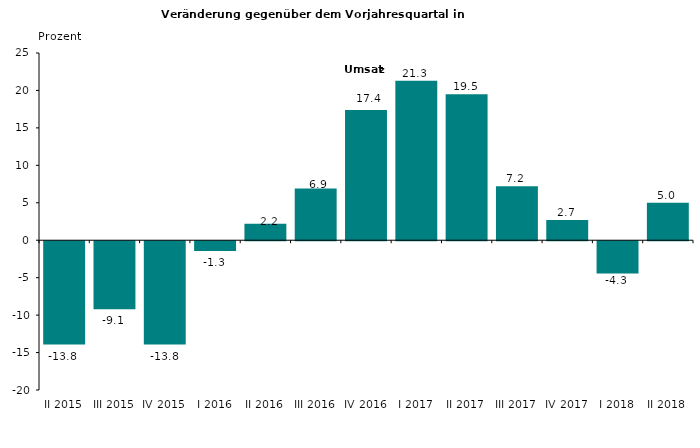
| Category | -13,8 -9,1 -13,8 -1,3 2,2 6,9 17,4 21,3 19,5 7,2 2,7 -4,3 5,0 |
|---|---|
| II 2015 | -13.8 |
| III 2015 | -9.1 |
| IV 2015 | -13.8 |
| I 2016 | -1.3 |
| II 2016 | 2.2 |
| III 2016 | 6.9 |
| IV 2016 | 17.4 |
| I 2017 | 21.3 |
| II 2017 | 19.5 |
| III 2017 | 7.2 |
| IV 2017 | 2.7 |
| I 2018 | -4.3 |
| II 2018 | 5 |